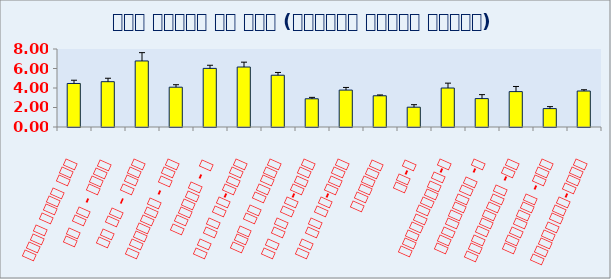
| Category | Yield (Kg/Plot) |
|---|---|
| केशर किंग ९१९ | 4.463 |
| एस एस - ६०६६ | 4.648 |
| एस एस – ७०७७ | 6.775 |
| गोदावरी - ९८९ | 4.083 |
| चैलेंज - १ | 6.011 |
| डी के सी-८१०१ | 6.151 |
| ९०० एम गोल्ड | 5.309 |
| डी के सी-७०७४ | 2.895 |
| डी के सी-९११७ | 3.785 |
| प्रकाश | 3.203 |
| जी-६ | 2.032 |
| जीएवाईएमएच-१ | 3.998 |
| जीडब्लूएल -८ | 2.912 |
| जीडब्लूएल -१५ | 3.631 |
| जीवाईएस -७०५ | 1.887 |
| क्यूपीएम-०९०३ | 3.689 |